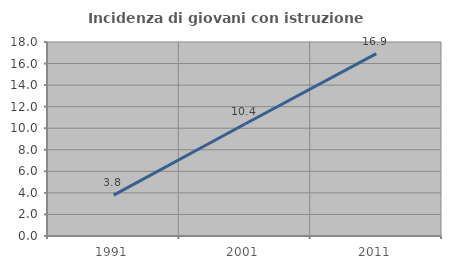
| Category | Incidenza di giovani con istruzione universitaria |
|---|---|
| 1991.0 | 3.788 |
| 2001.0 | 10.39 |
| 2011.0 | 16.923 |